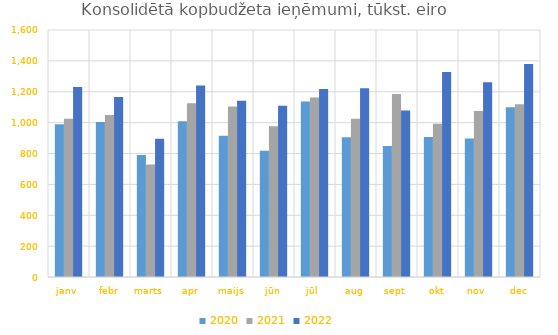
| Category | 2020 | 2021 | 2022 |
|---|---|---|---|
| janv | 990255.966 | 1025729.219 | 1230170.047 |
| febr | 1003986.803 | 1050032.948 | 1166379.907 |
| marts | 790973.859 | 729450.354 | 896198.796 |
| apr | 1008343.173 | 1125852.842 | 1240480.294 |
| maijs | 915661.348 | 1104155.322 | 1141583.555 |
| jūn | 817524.851 | 976600.628 | 1110073.881 |
| jūl | 1137278.065 | 1162632.002 | 1217508.617 |
| aug | 905597.447 | 1025720.022 | 1222030.584 |
| sept | 848822.405 | 1184851.081 | 1079167.695 |
| okt | 906227.444 | 993429.183 | 1328712.607 |
| nov | 896995.399 | 1074941.099 | 1261934.438 |
| dec | 1098839.178 | 1118858.021 | 1379607.658 |